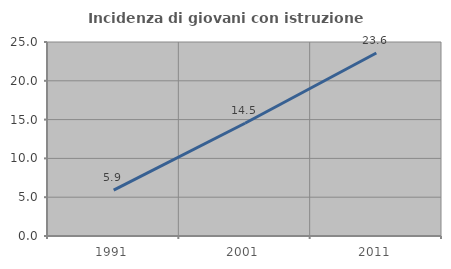
| Category | Incidenza di giovani con istruzione universitaria |
|---|---|
| 1991.0 | 5.913 |
| 2001.0 | 14.526 |
| 2011.0 | 23.587 |